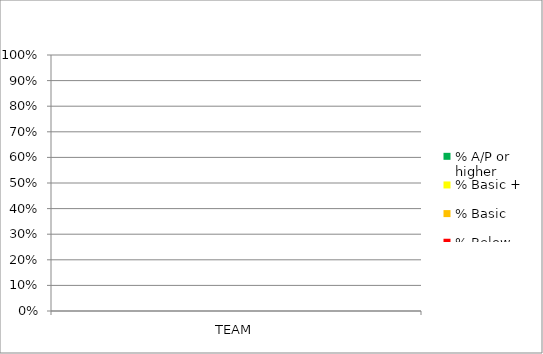
| Category | % A/P or higher | % Basic + | % Basic  | % Below Basic |
|---|---|---|---|---|
| TEAM | 0 | 0 | 0 | 0 |